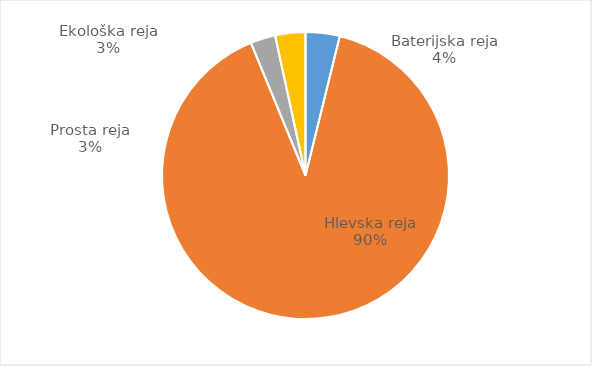
| Category | Količina kosov jajc |
|---|---|
| Baterijska reja | 124084 |
| Hlevska reja | 2907679 |
| Prosta reja | 90522 |
| Ekološka reja | 110136 |